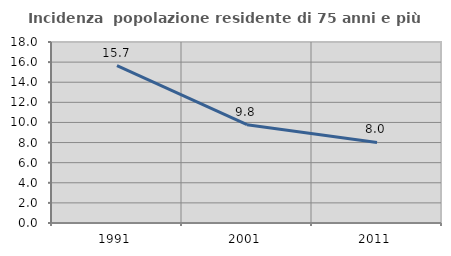
| Category | Incidenza  popolazione residente di 75 anni e più |
|---|---|
| 1991.0 | 15.658 |
| 2001.0 | 9.776 |
| 2011.0 | 8.015 |